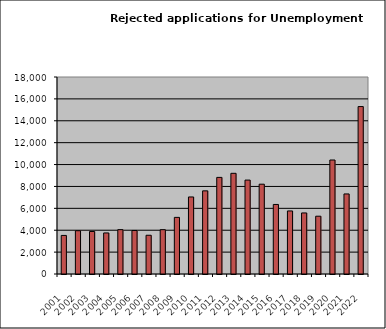
| Category | Series 0 |
|---|---|
| 2001.0 | 3524 |
| 2002.0 | 3955 |
| 2003.0 | 3884 |
| 2004.0 | 3751 |
| 2005.0 | 4053 |
| 2006.0 | 3977 |
| 2007.0 | 3540 |
| 2008.0 | 4050 |
| 2009.0 | 5173 |
| 2010.0 | 7039 |
| 2011.0 | 7598 |
| 2012.0 | 8826 |
| 2013.0 | 9199 |
| 2014.0 | 8581 |
| 2015.0 | 8206 |
| 2016.0 | 6354 |
| 2017.0 | 5761 |
| 2018.0 | 5579 |
| 2019.0 | 5280 |
| 2020.0 | 10416 |
| 2021.0 | 7314 |
| 2022.0 | 15298 |